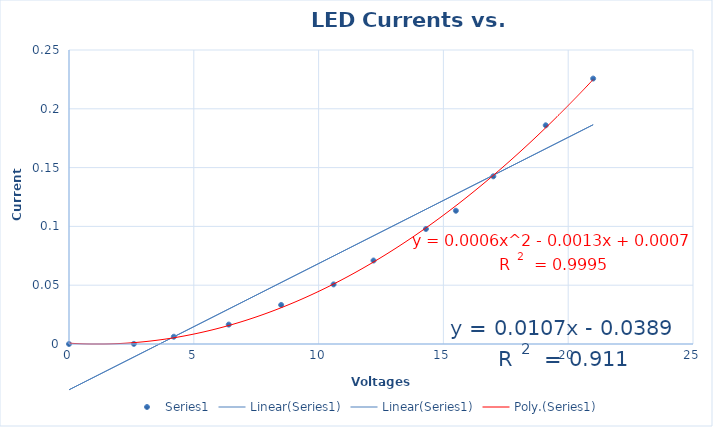
| Category | Series 0 |
|---|---|
| 2.6 | 0 |
| 4.2 | 0.006 |
| 6.4 | 0.017 |
| 8.5 | 0.033 |
| 10.6 | 0.051 |
| 12.2 | 0.071 |
| 14.3 | 0.098 |
| 15.5 | 0.113 |
| 17.0 | 0.143 |
| 19.1 | 0.186 |
| 21.0 | 0.226 |
| 0.0 | 0 |